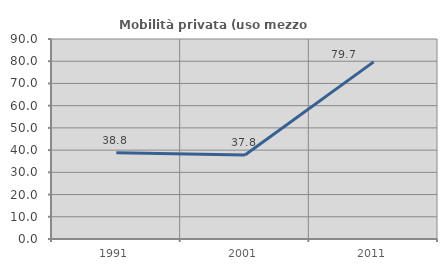
| Category | Mobilità privata (uso mezzo privato) |
|---|---|
| 1991.0 | 38.838 |
| 2001.0 | 37.793 |
| 2011.0 | 79.72 |